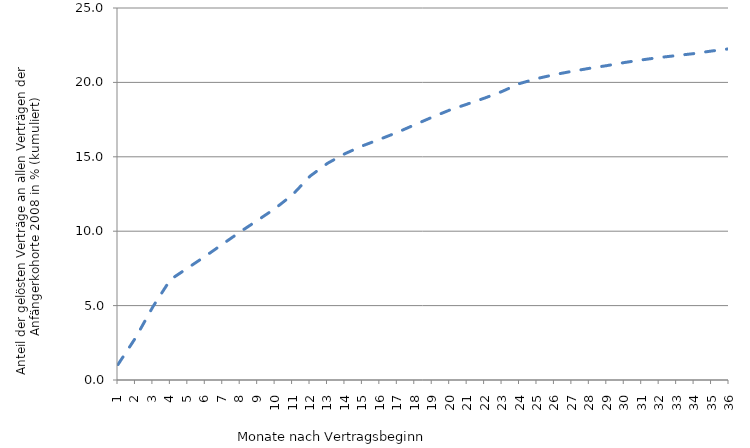
| Category | insgesamt |
|---|---|
| 1.0 | 1.039 |
| 2.0 | 2.823 |
| 3.0 | 4.925 |
| 4.0 | 6.748 |
| 5.0 | 7.53 |
| 6.0 | 8.316 |
| 7.0 | 9.138 |
| 8.0 | 9.956 |
| 9.0 | 10.735 |
| 10.0 | 11.529 |
| 11.0 | 12.449 |
| 12.0 | 13.699 |
| 13.0 | 14.562 |
| 14.0 | 15.208 |
| 15.0 | 15.735 |
| 16.0 | 16.18 |
| 17.0 | 16.641 |
| 18.0 | 17.156 |
| 19.0 | 17.663 |
| 20.0 | 18.141 |
| 21.0 | 18.54 |
| 22.0 | 18.945 |
| 23.0 | 19.391 |
| 24.0 | 19.92 |
| 25.0 | 20.258 |
| 26.0 | 20.52 |
| 27.0 | 20.744 |
| 28.0 | 20.944 |
| 29.0 | 21.127 |
| 30.0 | 21.334 |
| 31.0 | 21.512 |
| 32.0 | 21.672 |
| 33.0 | 21.803 |
| 34.0 | 21.937 |
| 35.0 | 22.109 |
| 36.0 | 22.256 |